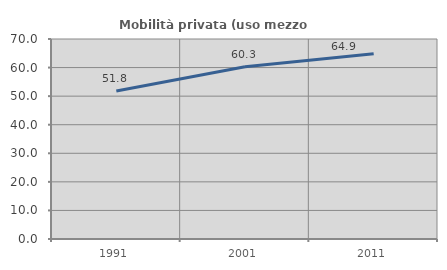
| Category | Mobilità privata (uso mezzo privato) |
|---|---|
| 1991.0 | 51.825 |
| 2001.0 | 60.305 |
| 2011.0 | 64.857 |